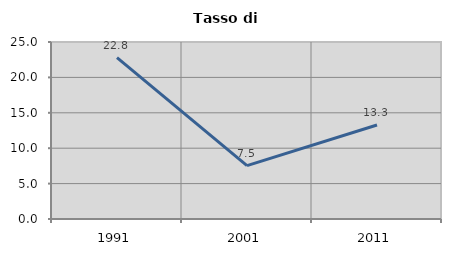
| Category | Tasso di disoccupazione   |
|---|---|
| 1991.0 | 22.792 |
| 2001.0 | 7.534 |
| 2011.0 | 13.281 |